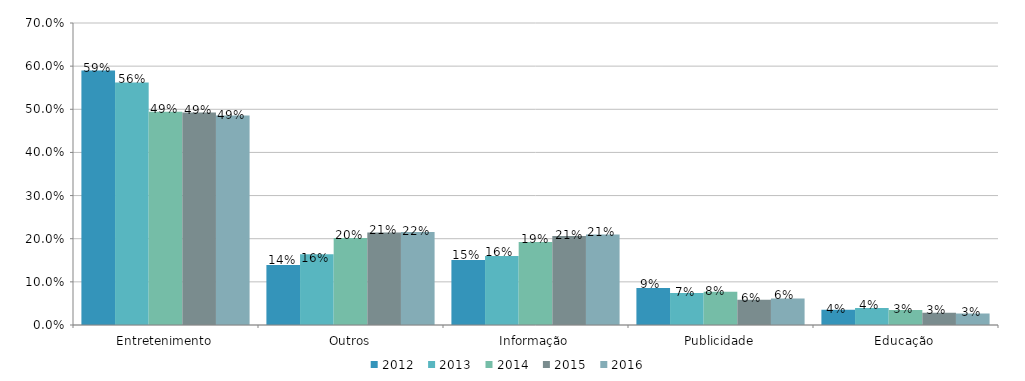
| Category | 2012 | 2013 | 2014 | 2015 | 2016 |
|---|---|---|---|---|---|
| Entretenimento | 0.59 | 0.562 | 0.494 | 0.493 | 0.486 |
| Outros | 0.139 | 0.164 | 0.201 | 0.214 | 0.216 |
| Informação | 0.151 | 0.16 | 0.193 | 0.206 | 0.21 |
| Publicidade | 0.086 | 0.074 | 0.077 | 0.059 | 0.062 |
| Educação | 0.035 | 0.039 | 0.035 | 0.028 | 0.027 |